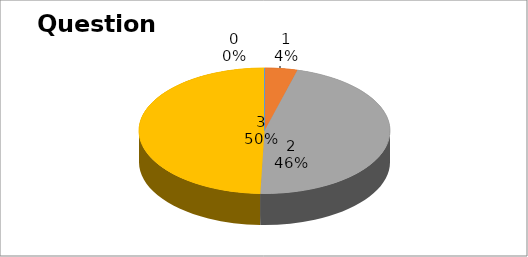
| Category | Series 0 |
|---|---|
| 0 | 0 |
| 1 | 4 |
| 2 | 44 |
| 3 | 47 |